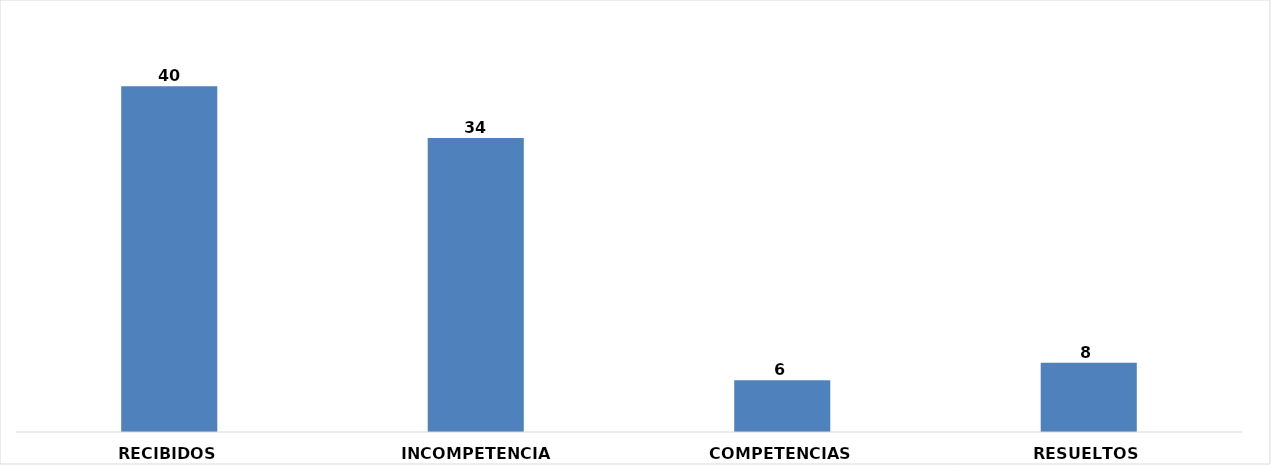
| Category | CANTIDAD |
|---|---|
| RECIBIDOS | 40 |
| INCOMPETENCIAS | 34 |
| COMPETENCIAS | 6 |
| RESUELTOS | 8 |